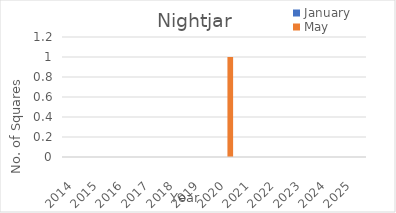
| Category | January | May |
|---|---|---|
| 2014.0 | 0 | 0 |
| 2015.0 | 0 | 0 |
| 2016.0 | 0 | 0 |
| 2017.0 | 0 | 0 |
| 2018.0 | 0 | 0 |
| 2019.0 | 0 | 0 |
| 2020.0 | 0 | 1 |
| 2021.0 | 0 | 0 |
| 2022.0 | 0 | 0 |
| 2023.0 | 0 | 0 |
| 2024.0 | 0 | 0 |
| 2025.0 | 0 | 0 |